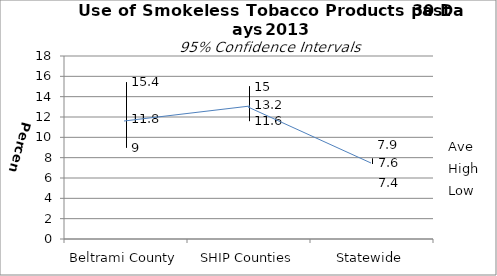
| Category | Ave | High | Low |
|---|---|---|---|
| Beltrami County | 11.8 | 15.4 | 9 |
| SHIP Counties | 13.2 | 15 | 11.6 |
| Statewide | 7.6 | 7.9 | 7.4 |